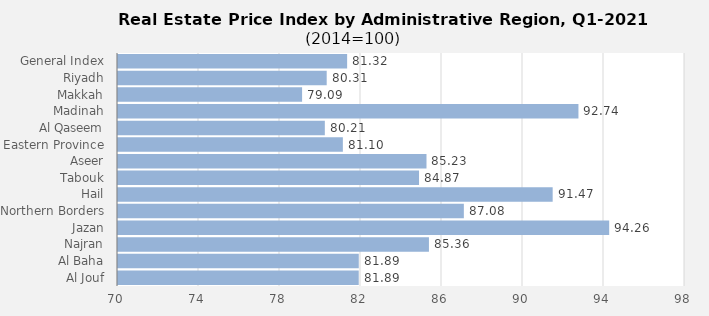
| Category | 2021 |
|---|---|
| General Index | 81.315 |
| Riyadh | 80.306 |
| Makkah | 79.091 |
| Madinah | 92.738 |
| Al Qaseem | 80.214 |
| Eastern Province | 81.104 |
| Aseer | 85.234 |
| Tabouk | 84.865 |
| Hail | 91.465 |
| Northern Borders | 87.079 |
| Jazan | 94.256 |
| Najran | 85.355 |
| Al Baha | 81.89 |
| Al Jouf | 81.888 |